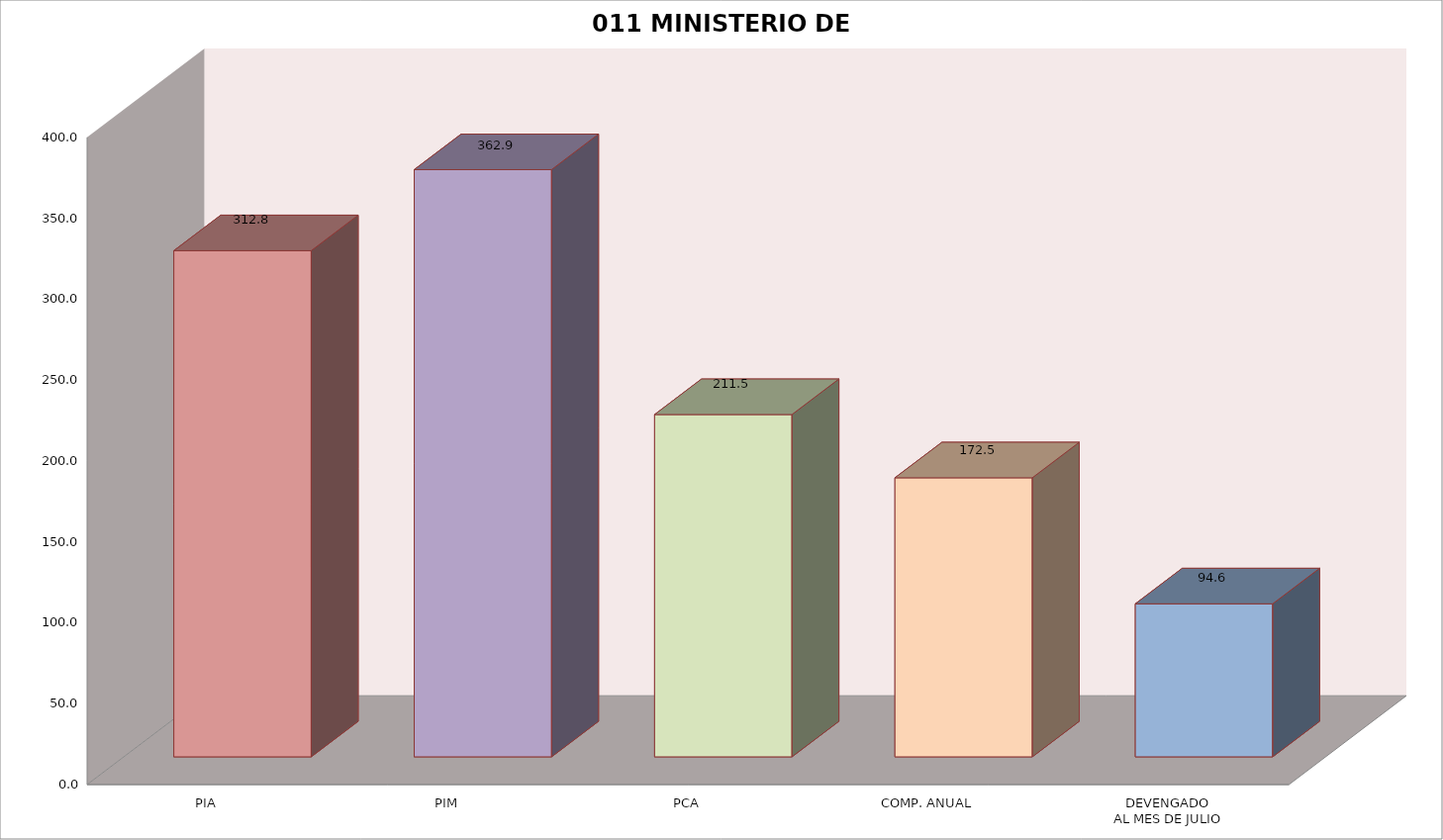
| Category | 011 MINISTERIO DE SALUD |
|---|---|
| PIA | 312.801 |
| PIM | 362.893 |
| PCA | 211.539 |
| COMP. ANUAL | 172.453 |
| DEVENGADO
AL MES DE JULIO | 94.572 |